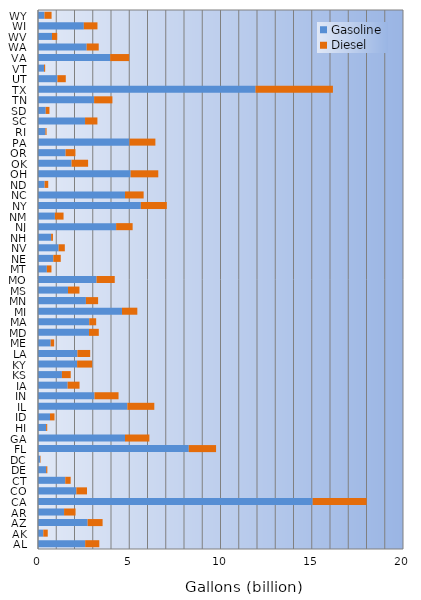
| Category | Gasoline | Diesel |
|---|---|---|
| AL | 2.584 | 0.774 |
| AK | 0.29 | 0.245 |
| AZ | 2.72 | 0.819 |
| AR | 1.429 | 0.628 |
| CA | 15.052 | 2.957 |
| CO | 2.102 | 0.583 |
| CT | 1.494 | 0.296 |
| DE | 0.446 | 0.066 |
| DC | 0.116 | 0.027 |
| FL | 8.262 | 1.496 |
| GA | 4.767 | 1.336 |
| HI | 0.446 | 0.059 |
| ID | 0.659 | 0.247 |
| IL | 4.896 | 1.477 |
| IN | 3.096 | 1.317 |
| IA | 1.624 | 0.652 |
| KS | 1.311 | 0.482 |
| KY | 2.144 | 0.822 |
| LA | 2.161 | 0.699 |
| ME | 0.694 | 0.192 |
| MD | 2.796 | 0.535 |
| MA | 2.808 | 0.38 |
| MI | 4.601 | 0.842 |
| MN | 2.625 | 0.668 |
| MS | 1.645 | 0.626 |
| MO | 3.209 | 0.997 |
| MT | 0.484 | 0.253 |
| NE | 0.838 | 0.409 |
| NV | 1.131 | 0.339 |
| NH | 0.719 | 0.099 |
| NJ | 4.281 | 0.905 |
| NM | 0.926 | 0.474 |
| NY | 5.634 | 1.423 |
| NC | 4.767 | 1.022 |
| ND | 0.363 | 0.199 |
| OH | 5.076 | 1.514 |
| OK | 1.839 | 0.907 |
| OR | 1.511 | 0.54 |
| PA | 5.011 | 1.421 |
| RI | 0.407 | 0.063 |
| SC | 2.578 | 0.678 |
| SD | 0.422 | 0.206 |
| TN | 3.075 | 1.003 |
| TX | 11.918 | 4.242 |
| UT | 1.064 | 0.459 |
| VT | 0.331 | 0.061 |
| VA | 3.955 | 1.038 |
| WA | 2.666 | 0.661 |
| WV | 0.767 | 0.287 |
| WI | 2.512 | 0.747 |
| WY | 0.354 | 0.39 |